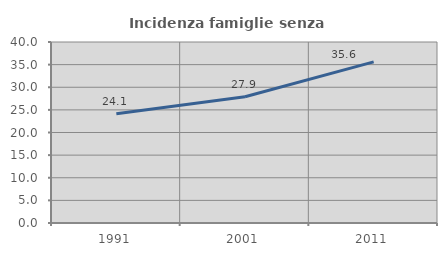
| Category | Incidenza famiglie senza nuclei |
|---|---|
| 1991.0 | 24.145 |
| 2001.0 | 27.895 |
| 2011.0 | 35.601 |